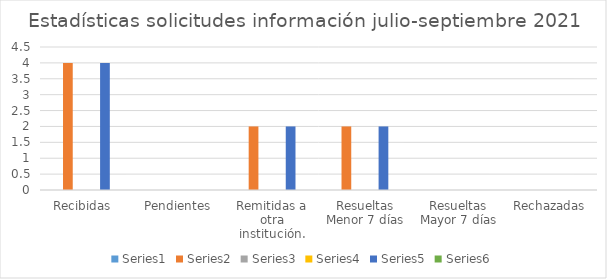
| Category | Series 0 | Series 1 | Series 2 | Series 3 | Series 4 | Series 5 |
|---|---|---|---|---|---|---|
| Recibidas  | 0 | 4 | 0 | 0 | 4 |  |
| Pendientes | 0 | 0 | 0 | 0 | 0 |  |
| Remitidas a otra institución. | 0 | 2 | 0 | 0 | 2 |  |
| Resueltas Menor 7 días | 0 | 2 | 0 | 0 | 2 |  |
| Resueltas Mayor 7 días | 0 | 0 | 0 | 0 | 0 |  |
| Rechazadas | 0 | 0 | 0 | 0 | 0 |  |